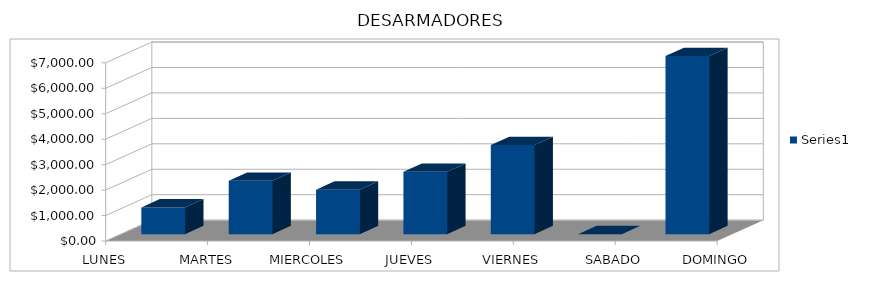
| Category | Series 0 |
|---|---|
| LUNES | 1050 |
| MARTES | 2100 |
| MIERCOLES | 1750 |
| JUEVES | 2450 |
| VIERNES | 3500 |
| SABADO | 0 |
| DOMINGO | 7000 |